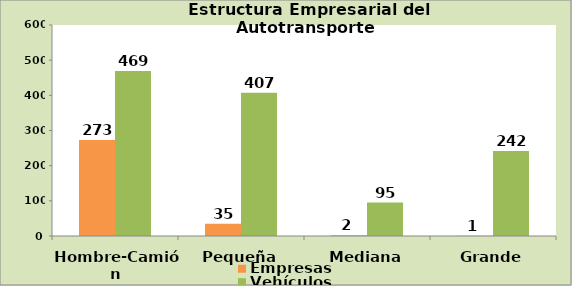
| Category | Empresas | Vehículos |
|---|---|---|
| Hombre-Camión | 273 | 469 |
| Pequeña | 35 | 407 |
| Mediana | 2 | 95 |
| Grande | 1 | 242 |